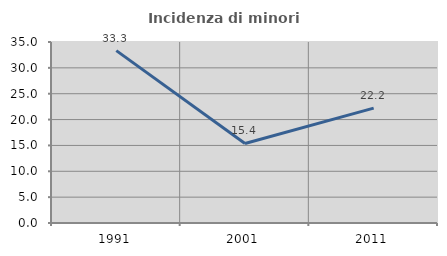
| Category | Incidenza di minori stranieri |
|---|---|
| 1991.0 | 33.333 |
| 2001.0 | 15.385 |
| 2011.0 | 22.222 |